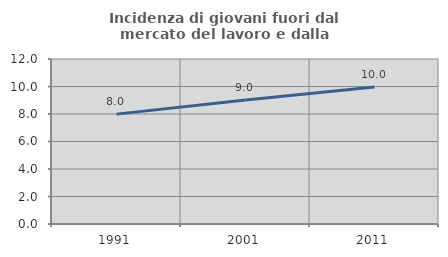
| Category | Incidenza di giovani fuori dal mercato del lavoro e dalla formazione  |
|---|---|
| 1991.0 | 7.991 |
| 2001.0 | 9.014 |
| 2011.0 | 9.971 |